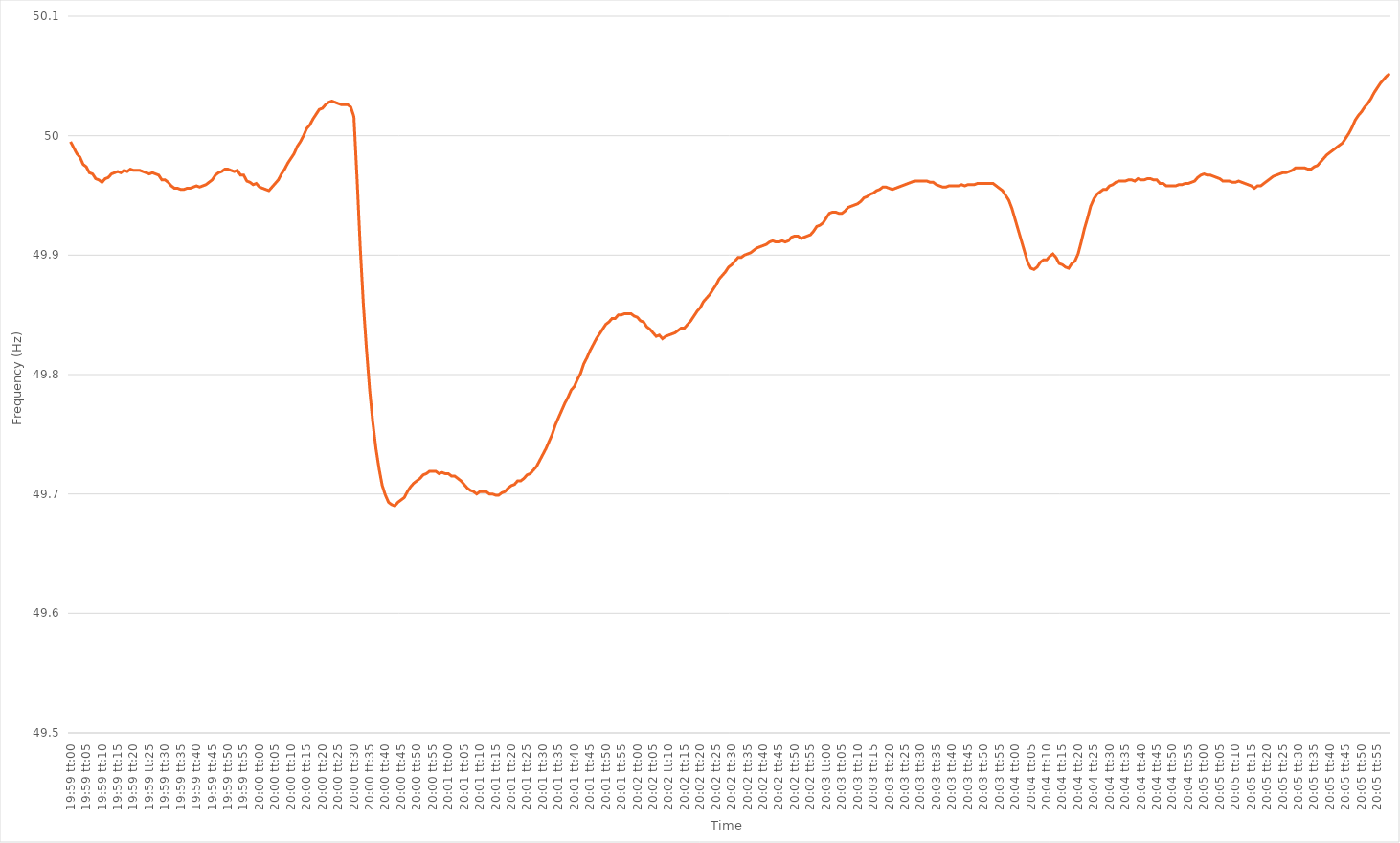
| Category | Series 0 |
|---|---|
| 0.8326388888888889 | 49.995 |
| 0.8326504629629629 | 49.99 |
| 0.832662037037037 | 49.985 |
| 0.8326736111111112 | 49.982 |
| 0.8326851851851852 | 49.976 |
| 0.8326967592592592 | 49.974 |
| 0.8327083333333333 | 49.969 |
| 0.8327199074074074 | 49.968 |
| 0.8327314814814816 | 49.964 |
| 0.8327430555555555 | 49.963 |
| 0.8327546296296297 | 49.961 |
| 0.8327662037037037 | 49.964 |
| 0.8327777777777778 | 49.965 |
| 0.8327893518518518 | 49.968 |
| 0.8328009259259259 | 49.969 |
| 0.8328125000000001 | 49.97 |
| 0.8328240740740741 | 49.969 |
| 0.8328356481481481 | 49.971 |
| 0.8328472222222222 | 49.97 |
| 0.8328587962962963 | 49.972 |
| 0.8328703703703703 | 49.971 |
| 0.8328819444444444 | 49.971 |
| 0.8328935185185186 | 49.971 |
| 0.8329050925925926 | 49.97 |
| 0.8329166666666666 | 49.969 |
| 0.8329282407407407 | 49.968 |
| 0.8329398148148148 | 49.969 |
| 0.832951388888889 | 49.968 |
| 0.8329629629629629 | 49.967 |
| 0.832974537037037 | 49.963 |
| 0.8329861111111111 | 49.963 |
| 0.8329976851851852 | 49.961 |
| 0.8330092592592592 | 49.958 |
| 0.8330208333333333 | 49.956 |
| 0.8330324074074075 | 49.956 |
| 0.8330439814814815 | 49.955 |
| 0.8330555555555555 | 49.955 |
| 0.8330671296296296 | 49.956 |
| 0.8330787037037037 | 49.956 |
| 0.8330902777777777 | 49.957 |
| 0.8331018518518518 | 49.958 |
| 0.833113425925926 | 49.957 |
| 0.833125 | 49.958 |
| 0.833136574074074 | 49.959 |
| 0.8331481481481481 | 49.961 |
| 0.8331597222222222 | 49.963 |
| 0.8331712962962964 | 49.967 |
| 0.8331828703703703 | 49.969 |
| 0.8331944444444445 | 49.97 |
| 0.8332060185185185 | 49.972 |
| 0.8332175925925926 | 49.972 |
| 0.8332291666666666 | 49.971 |
| 0.8332407407407407 | 49.97 |
| 0.8332523148148149 | 49.971 |
| 0.8332638888888889 | 49.967 |
| 0.833275462962963 | 49.967 |
| 0.833287037037037 | 49.962 |
| 0.8332986111111111 | 49.961 |
| 0.8333101851851853 | 49.959 |
| 0.8333217592592592 | 49.96 |
| 0.8333333333333334 | 49.957 |
| 0.8333449074074074 | 49.956 |
| 0.8333564814814814 | 49.955 |
| 0.8333680555555555 | 49.954 |
| 0.8333796296296296 | 49.957 |
| 0.8333912037037038 | 49.96 |
| 0.8334027777777777 | 49.963 |
| 0.8334143518518519 | 49.968 |
| 0.8334259259259259 | 49.972 |
| 0.8334375 | 49.977 |
| 0.833449074074074 | 49.981 |
| 0.8334606481481481 | 49.985 |
| 0.8334722222222223 | 49.991 |
| 0.8334837962962963 | 49.995 |
| 0.8334953703703704 | 50 |
| 0.8335069444444444 | 50.006 |
| 0.8335185185185185 | 50.009 |
| 0.8335300925925927 | 50.014 |
| 0.8335416666666666 | 50.018 |
| 0.8335532407407408 | 50.022 |
| 0.8335648148148148 | 50.023 |
| 0.8335763888888889 | 50.026 |
| 0.8335879629629629 | 50.028 |
| 0.833599537037037 | 50.029 |
| 0.8336111111111112 | 50.028 |
| 0.8336226851851851 | 50.027 |
| 0.8336342592592593 | 50.026 |
| 0.8336458333333333 | 50.026 |
| 0.8336574074074075 | 50.026 |
| 0.8336689814814814 | 50.024 |
| 0.8336805555555555 | 50.016 |
| 0.8336921296296297 | 49.964 |
| 0.8337037037037037 | 49.907 |
| 0.8337152777777778 | 49.859 |
| 0.8337268518518518 | 49.821 |
| 0.833738425925926 | 49.787 |
| 0.8337500000000001 | 49.76 |
| 0.833761574074074 | 49.738 |
| 0.8337731481481482 | 49.721 |
| 0.8337847222222222 | 49.707 |
| 0.8337962962962964 | 49.699 |
| 0.8338078703703703 | 49.693 |
| 0.8338194444444444 | 49.691 |
| 0.8338310185185186 | 49.69 |
| 0.8338425925925925 | 49.693 |
| 0.8338541666666667 | 49.695 |
| 0.8338657407407407 | 49.697 |
| 0.8338773148148149 | 49.702 |
| 0.8338888888888888 | 49.706 |
| 0.8339004629629629 | 49.709 |
| 0.8339120370370371 | 49.711 |
| 0.8339236111111111 | 49.713 |
| 0.8339351851851852 | 49.716 |
| 0.8339467592592592 | 49.717 |
| 0.8339583333333334 | 49.719 |
| 0.8339699074074075 | 49.719 |
| 0.8339814814814814 | 49.719 |
| 0.8339930555555556 | 49.717 |
| 0.8340046296296296 | 49.718 |
| 0.8340162037037038 | 49.717 |
| 0.8340277777777777 | 49.717 |
| 0.8340393518518519 | 49.715 |
| 0.834050925925926 | 49.715 |
| 0.8340624999999999 | 49.713 |
| 0.8340740740740741 | 49.711 |
| 0.8340856481481481 | 49.708 |
| 0.8340972222222223 | 49.705 |
| 0.8341087962962962 | 49.703 |
| 0.8341203703703703 | 49.702 |
| 0.8341319444444445 | 49.7 |
| 0.8341435185185185 | 49.702 |
| 0.8341550925925926 | 49.702 |
| 0.8341666666666666 | 49.702 |
| 0.8341782407407408 | 49.7 |
| 0.8341898148148149 | 49.7 |
| 0.8342013888888888 | 49.699 |
| 0.834212962962963 | 49.699 |
| 0.834224537037037 | 49.701 |
| 0.8342361111111112 | 49.702 |
| 0.8342476851851851 | 49.705 |
| 0.8342592592592593 | 49.707 |
| 0.8342708333333334 | 49.708 |
| 0.8342824074074073 | 49.711 |
| 0.8342939814814815 | 49.711 |
| 0.8343055555555555 | 49.713 |
| 0.8343171296296297 | 49.716 |
| 0.8343287037037036 | 49.717 |
| 0.8343402777777778 | 49.72 |
| 0.8343518518518519 | 49.723 |
| 0.8343634259259259 | 49.728 |
| 0.834375 | 49.733 |
| 0.834386574074074 | 49.738 |
| 0.8343981481481482 | 49.744 |
| 0.8344097222222223 | 49.75 |
| 0.8344212962962962 | 49.758 |
| 0.8344328703703704 | 49.764 |
| 0.8344444444444444 | 49.77 |
| 0.8344560185185186 | 49.776 |
| 0.8344675925925925 | 49.781 |
| 0.8344791666666667 | 49.787 |
| 0.8344907407407408 | 49.79 |
| 0.8345023148148148 | 49.796 |
| 0.8345138888888889 | 49.801 |
| 0.8345254629629629 | 49.809 |
| 0.8345370370370371 | 49.814 |
| 0.834548611111111 | 49.82 |
| 0.8345601851851852 | 49.825 |
| 0.8345717592592593 | 49.83 |
| 0.8345833333333333 | 49.834 |
| 0.8345949074074074 | 49.838 |
| 0.8346064814814814 | 49.842 |
| 0.8346180555555556 | 49.844 |
| 0.8346296296296297 | 49.847 |
| 0.8346412037037036 | 49.847 |
| 0.8346527777777778 | 49.85 |
| 0.8346643518518518 | 49.85 |
| 0.834675925925926 | 49.851 |
| 0.8346874999999999 | 49.851 |
| 0.8346990740740741 | 49.851 |
| 0.8347106481481482 | 49.849 |
| 0.8347222222222223 | 49.848 |
| 0.8347337962962963 | 49.845 |
| 0.8347453703703703 | 49.844 |
| 0.8347569444444445 | 49.84 |
| 0.8347685185185184 | 49.838 |
| 0.8347800925925926 | 49.835 |
| 0.8347916666666667 | 49.832 |
| 0.8348032407407407 | 49.833 |
| 0.8348148148148148 | 49.83 |
| 0.8348263888888888 | 49.832 |
| 0.834837962962963 | 49.833 |
| 0.8348495370370371 | 49.834 |
| 0.834861111111111 | 49.835 |
| 0.8348726851851852 | 49.837 |
| 0.8348842592592592 | 49.839 |
| 0.8348958333333334 | 49.839 |
| 0.8349074074074073 | 49.842 |
| 0.8349189814814815 | 49.845 |
| 0.8349305555555556 | 49.849 |
| 0.8349421296296297 | 49.853 |
| 0.8349537037037037 | 49.856 |
| 0.8349652777777777 | 49.861 |
| 0.8349768518518519 | 49.864 |
| 0.834988425925926 | 49.867 |
| 0.835 | 49.871 |
| 0.8350115740740741 | 49.875 |
| 0.8350231481481482 | 49.88 |
| 0.8350347222222222 | 49.883 |
| 0.8350462962962962 | 49.886 |
| 0.8350578703703704 | 49.89 |
| 0.8350694444444445 | 49.892 |
| 0.8350810185185185 | 49.895 |
| 0.8350925925925926 | 49.898 |
| 0.8351041666666666 | 49.898 |
| 0.8351157407407408 | 49.9 |
| 0.8351273148148147 | 49.901 |
| 0.8351388888888889 | 49.902 |
| 0.835150462962963 | 49.904 |
| 0.8351620370370371 | 49.906 |
| 0.8351736111111111 | 49.907 |
| 0.8351851851851851 | 49.908 |
| 0.8351967592592593 | 49.909 |
| 0.8352083333333334 | 49.911 |
| 0.8352199074074074 | 49.912 |
| 0.8352314814814815 | 49.911 |
| 0.8352430555555556 | 49.911 |
| 0.8352546296296296 | 49.912 |
| 0.8352662037037036 | 49.911 |
| 0.8352777777777778 | 49.912 |
| 0.8352893518518519 | 49.915 |
| 0.8353009259259259 | 49.916 |
| 0.8353125 | 49.916 |
| 0.835324074074074 | 49.914 |
| 0.8353356481481482 | 49.915 |
| 0.8353472222222221 | 49.916 |
| 0.8353587962962963 | 49.917 |
| 0.8353703703703704 | 49.92 |
| 0.8353819444444445 | 49.924 |
| 0.8353935185185185 | 49.925 |
| 0.8354050925925925 | 49.927 |
| 0.8354166666666667 | 49.931 |
| 0.8354282407407408 | 49.935 |
| 0.8354398148148148 | 49.936 |
| 0.8354513888888889 | 49.936 |
| 0.835462962962963 | 49.935 |
| 0.835474537037037 | 49.935 |
| 0.835486111111111 | 49.937 |
| 0.8354976851851852 | 49.94 |
| 0.8355092592592593 | 49.941 |
| 0.8355208333333333 | 49.942 |
| 0.8355324074074074 | 49.943 |
| 0.8355439814814815 | 49.945 |
| 0.8355555555555556 | 49.948 |
| 0.8355671296296295 | 49.949 |
| 0.8355787037037037 | 49.951 |
| 0.8355902777777778 | 49.952 |
| 0.8356018518518519 | 49.954 |
| 0.8356134259259259 | 49.955 |
| 0.835625 | 49.957 |
| 0.8356365740740741 | 49.957 |
| 0.8356481481481483 | 49.956 |
| 0.8356597222222222 | 49.955 |
| 0.8356712962962963 | 49.956 |
| 0.8356828703703704 | 49.957 |
| 0.8356944444444445 | 49.958 |
| 0.8357060185185184 | 49.959 |
| 0.8357175925925926 | 49.96 |
| 0.8357291666666667 | 49.961 |
| 0.8357407407407407 | 49.962 |
| 0.8357523148148148 | 49.962 |
| 0.8357638888888889 | 49.962 |
| 0.835775462962963 | 49.962 |
| 0.8357870370370369 | 49.962 |
| 0.8357986111111111 | 49.961 |
| 0.8358101851851852 | 49.961 |
| 0.8358217592592593 | 49.959 |
| 0.8358333333333333 | 49.958 |
| 0.8358449074074074 | 49.957 |
| 0.8358564814814815 | 49.957 |
| 0.8358680555555557 | 49.958 |
| 0.8358796296296296 | 49.958 |
| 0.8358912037037037 | 49.958 |
| 0.8359027777777778 | 49.958 |
| 0.8359143518518519 | 49.959 |
| 0.8359259259259259 | 49.958 |
| 0.8359375 | 49.959 |
| 0.8359490740740741 | 49.959 |
| 0.8359606481481481 | 49.959 |
| 0.8359722222222222 | 49.96 |
| 0.8359837962962963 | 49.96 |
| 0.8359953703703704 | 49.96 |
| 0.8360069444444443 | 49.96 |
| 0.8360185185185185 | 49.96 |
| 0.8360300925925926 | 49.96 |
| 0.8360416666666667 | 49.958 |
| 0.8360532407407407 | 49.956 |
| 0.8360648148148148 | 49.954 |
| 0.8360763888888889 | 49.95 |
| 0.8360879629629631 | 49.946 |
| 0.836099537037037 | 49.939 |
| 0.8361111111111111 | 49.93 |
| 0.8361226851851852 | 49.921 |
| 0.8361342592592593 | 49.912 |
| 0.8361458333333333 | 49.903 |
| 0.8361574074074074 | 49.894 |
| 0.8361689814814816 | 49.889 |
| 0.8361805555555555 | 49.888 |
| 0.8361921296296296 | 49.89 |
| 0.8362037037037037 | 49.894 |
| 0.8362152777777778 | 49.896 |
| 0.8362268518518517 | 49.896 |
| 0.8362384259259259 | 49.899 |
| 0.83625 | 49.901 |
| 0.8362615740740741 | 49.898 |
| 0.8362731481481481 | 49.893 |
| 0.8362847222222222 | 49.892 |
| 0.8362962962962963 | 49.89 |
| 0.8363078703703705 | 49.889 |
| 0.8363194444444444 | 49.893 |
| 0.8363310185185185 | 49.895 |
| 0.8363425925925926 | 49.901 |
| 0.8363541666666667 | 49.911 |
| 0.8363657407407407 | 49.922 |
| 0.8363773148148148 | 49.931 |
| 0.836388888888889 | 49.941 |
| 0.836400462962963 | 49.947 |
| 0.836412037037037 | 49.951 |
| 0.8364236111111111 | 49.953 |
| 0.8364351851851852 | 49.955 |
| 0.8364467592592592 | 49.955 |
| 0.8364583333333333 | 49.958 |
| 0.8364699074074075 | 49.959 |
| 0.8364814814814815 | 49.961 |
| 0.8364930555555555 | 49.962 |
| 0.8365046296296296 | 49.962 |
| 0.8365162037037037 | 49.962 |
| 0.8365277777777779 | 49.963 |
| 0.8365393518518518 | 49.963 |
| 0.836550925925926 | 49.962 |
| 0.8365625 | 49.964 |
| 0.8365740740740741 | 49.963 |
| 0.8365856481481481 | 49.963 |
| 0.8365972222222222 | 49.964 |
| 0.8366087962962964 | 49.964 |
| 0.8366203703703704 | 49.963 |
| 0.8366319444444444 | 49.963 |
| 0.8366435185185185 | 49.96 |
| 0.8366550925925926 | 49.96 |
| 0.8366666666666666 | 49.958 |
| 0.8366782407407407 | 49.958 |
| 0.8366898148148149 | 49.958 |
| 0.8367013888888889 | 49.958 |
| 0.8367129629629629 | 49.959 |
| 0.836724537037037 | 49.959 |
| 0.8367361111111111 | 49.96 |
| 0.8367476851851853 | 49.96 |
| 0.8367592592592592 | 49.961 |
| 0.8367708333333334 | 49.962 |
| 0.8367824074074074 | 49.965 |
| 0.8367939814814815 | 49.967 |
| 0.8368055555555555 | 49.968 |
| 0.8368171296296296 | 49.967 |
| 0.8368287037037038 | 49.967 |
| 0.8368402777777778 | 49.966 |
| 0.8368518518518518 | 49.965 |
| 0.8368634259259259 | 49.964 |
| 0.836875 | 49.962 |
| 0.836886574074074 | 49.962 |
| 0.8368981481481481 | 49.962 |
| 0.8369097222222223 | 49.961 |
| 0.8369212962962963 | 49.961 |
| 0.8369328703703703 | 49.962 |
| 0.8369444444444444 | 49.961 |
| 0.8369560185185185 | 49.96 |
| 0.8369675925925927 | 49.959 |
| 0.8369791666666666 | 49.958 |
| 0.8369907407407408 | 49.956 |
| 0.8370023148148148 | 49.958 |
| 0.837013888888889 | 49.958 |
| 0.8370254629629629 | 49.96 |
| 0.837037037037037 | 49.962 |
| 0.8370486111111112 | 49.964 |
| 0.8370601851851852 | 49.966 |
| 0.8370717592592593 | 49.967 |
| 0.8370833333333333 | 49.968 |
| 0.8370949074074074 | 49.969 |
| 0.8371064814814816 | 49.969 |
| 0.8371180555555555 | 49.97 |
| 0.8371296296296297 | 49.971 |
| 0.8371412037037037 | 49.973 |
| 0.8371527777777777 | 49.973 |
| 0.8371643518518518 | 49.973 |
| 0.8371759259259259 | 49.973 |
| 0.8371875000000001 | 49.972 |
| 0.837199074074074 | 49.972 |
| 0.8372106481481482 | 49.974 |
| 0.8372222222222222 | 49.975 |
| 0.8372337962962964 | 49.978 |
| 0.8372453703703703 | 49.981 |
| 0.8372569444444444 | 49.984 |
| 0.8372685185185186 | 49.986 |
| 0.8372800925925926 | 49.988 |
| 0.8372916666666667 | 49.99 |
| 0.8373032407407407 | 49.992 |
| 0.8373148148148148 | 49.994 |
| 0.837326388888889 | 49.998 |
| 0.8373379629629629 | 50.002 |
| 0.8373495370370371 | 50.007 |
| 0.8373611111111111 | 50.013 |
| 0.8373726851851852 | 50.017 |
| 0.8373842592592592 | 50.02 |
| 0.8373958333333333 | 50.024 |
| 0.8374074074074075 | 50.027 |
| 0.8374189814814814 | 50.031 |
| 0.8374305555555556 | 50.036 |
| 0.8374421296296296 | 50.04 |
| 0.8374537037037038 | 50.044 |
| 0.8374652777777777 | 50.047 |
| 0.8374768518518518 | 50.05 |
| 0.837488425925926 | 50.052 |